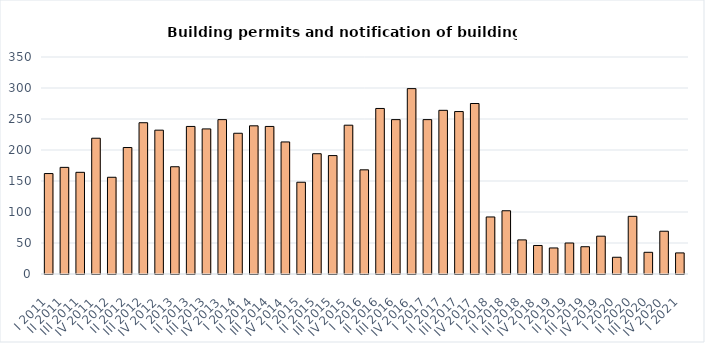
| Category | Building permits and notification of building work |
|---|---|
| I 2011 | 162 |
| II 2011 | 172 |
| III 2011 | 164 |
| IV 2011 | 219 |
| I 2012 | 156 |
| II 2012 | 204 |
| III 2012 | 244 |
| IV 2012 | 232 |
| I 2013 | 173 |
| II 2013 | 238 |
| III 2013 | 234 |
| IV 2013 | 249 |
| I 2014 | 227 |
| II 2014 | 239 |
| III 2014 | 238 |
| IV 2014 | 213 |
| I 2015 | 148 |
| II 2015 | 194 |
| III 2015 | 191 |
| IV 2015 | 240 |
| I 2016 | 168 |
| II 2016 | 267 |
| III 2016 | 249 |
| IV 2016 | 299 |
| I 2017 | 249 |
| II 2017 | 264 |
| III 2017 | 262 |
| IV 2017 | 275 |
| I 2018 | 92 |
| II 2018 | 102 |
| III 2018 | 55 |
| IV 2018 | 46 |
| I 2019 | 42 |
| II 2019 | 50 |
| III 2019 | 44 |
| IV 2019 | 61 |
| I 2020 | 27 |
| II 2020 | 93 |
| III 2020 | 35 |
| IV 2020 | 69 |
| I 2021 | 34 |